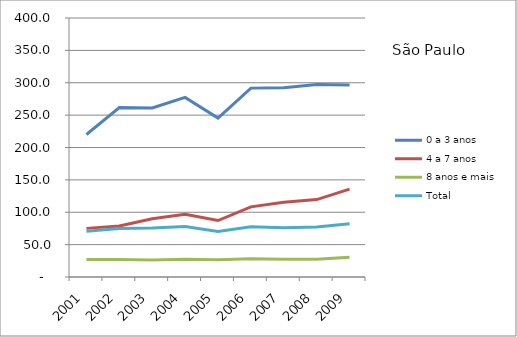
| Category | 0 a 3 anos | 4 a 7 anos | 8 anos e mais | Total |
|---|---|---|---|---|
| 2001.0 | 220.1 | 75.1 | 27 | 70.7 |
| 2002.0 | 261.6 | 78.7 | 27 | 74.9 |
| 2003.0 | 261 | 90 | 26.1 | 75.5 |
| 2004.0 | 277.4 | 96.8 | 27.5 | 78 |
| 2005.0 | 245.5 | 87.2 | 26.7 | 70.4 |
| 2006.0 | 291.7 | 108.3 | 28.1 | 77.6 |
| 2007.0 | 292.4 | 115.3 | 27.4 | 76.1 |
| 2008.0 | 297.4 | 119.6 | 27.5 | 77.4 |
| 2009.0 | 296.4 | 135.8 | 30.4 | 82.4 |